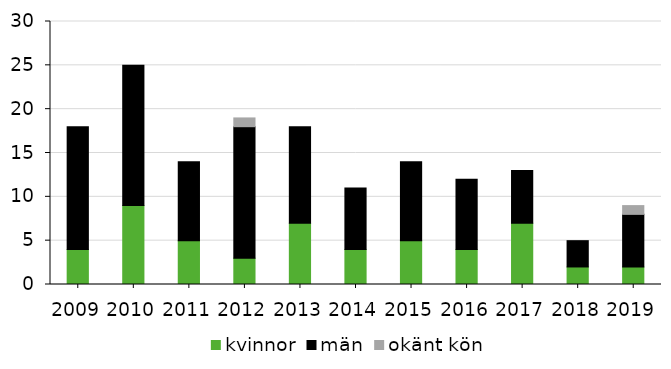
| Category | kvinnor | män | okänt kön |
|---|---|---|---|
| 2009 | 4 | 14 | 0 |
| 2010 | 9 | 16 | 0 |
| 2011 | 5 | 9 | 0 |
| 2012 | 3 | 15 | 1 |
| 2013 | 7 | 11 | 0 |
| 2014 | 4 | 7 | 0 |
| 2015 | 5 | 9 | 0 |
| 2016 | 4 | 8 | 0 |
| 2017 | 7 | 6 | 0 |
| 2018 | 2 | 3 | 0 |
| 2019 | 2 | 6 | 1 |